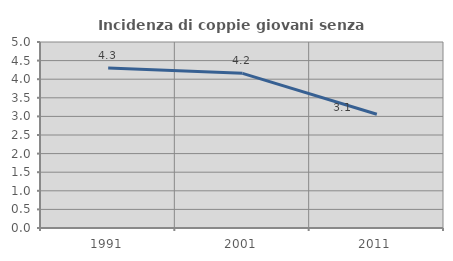
| Category | Incidenza di coppie giovani senza figli |
|---|---|
| 1991.0 | 4.302 |
| 2001.0 | 4.157 |
| 2011.0 | 3.059 |